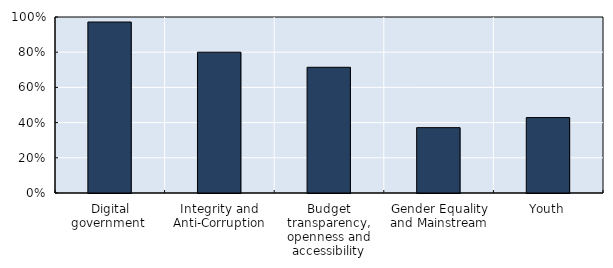
| Category | OECD35 |
|---|---|
| Digital government  | 0.971 |
| Integrity and Anti-Corruption | 0.8 |
| Budget transparency, openness and accessibility | 0.714 |
| Gender Equality and Mainstream | 0.371 |
| Youth | 0.429 |